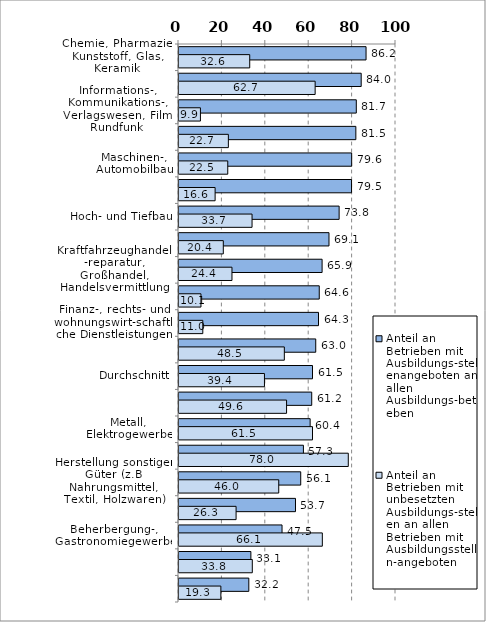
| Category | Anteil an Betrieben mit Ausbildungs-stellenangeboten an allen Ausbildungs-betrieben | Anteil an Betrieben mit unbesetzten Ausbildungs-stellen an allen Betrieben mit Ausbildungsstellen-angeboten |
|---|---|---|
| Chemie, Pharmazie, Kunststoff, Glas, Keramik | 86.204 | 32.593 |
| Landwirtschaft, Bergbau, Fischerei | 83.963 | 62.743 |
| Informations-, Kommunikations-, Verlagswesen, Film, Rundfunk | 81.705 | 9.873 |
| Verkehr, Lagerei, Frachtumschlag, Post-, Kurier-, Expressdienste | 81.496 | 22.748 |
| Maschinen-, Automobilbau | 79.572 | 22.469 |
| Energie-, Wasserversorgung; Abwasser-, Abfallentsorgung | 79.512 | 16.646 |
| Hoch- und Tiefbau | 73.792 | 33.666 |
| Erziehung und Unterricht | 69.121 | 20.419 |
| Kraftfahrzeughandel, -reparatur, Großhandel, Handelsvermittlung | 65.942 | 24.411 |
| Forschung, Entwicklung, Werbung, Marktforschung | 64.637 | 10.122 |
| Finanz-, rechts- und wohnungswirt-schaftliche Dienstleistungen | 64.288 | 10.973 |
| Einzelhandel, Tankstellen | 63.017 | 48.539 |
| Durchschnitt | 61.524 | 39.381 |
| Sonstige, überwiegend persönliche Dienstleistungen (z. B. Friseur) | 61.165 | 49.569 |
| Metall, Elektrogewerbe | 60.438 | 61.524 |
| Sonstige wirtschaftliche Dienst-leistungen (z.B. Veterinär, Reise) | 57.333 | 78.013 |
| Herstellung sonstiger Güter (z.B Nahrungsmittel, Textil, Holzwaren) | 56.094 | 45.966 |
| Pflegerische Dienstleistungen (z.B. Heime) | 53.685 | 26.309 |
| Beherbergung-, Gastronomiegewerbe | 47.48 | 66.054 |
| öffentliche Verwaltung, Verteidigung, Sozialversicherung, Interessenvertr. | 33.124 | 33.781 |